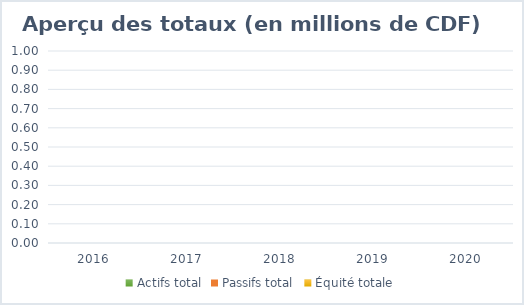
| Category | Actifs total | Passifs total | Équité totale |
|---|---|---|---|
| 2016.0 | 0 | 0 | 0 |
| 2017.0 | 0 | 0 | 0 |
| 2018.0 | 0 | 0 | 0 |
| 2019.0 | 0 | 0 | 0 |
| 2020.0 | 0 | 0 | 0 |